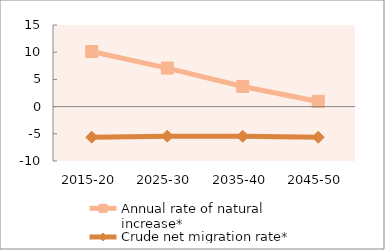
| Category | Annual rate of natural increase* | Crude net migration rate* |
|---|---|---|
| 2015-20 | 10.126 | -5.623 |
| 2025-30 | 7.084 | -5.446 |
| 2035-40 | 3.694 | -5.452 |
| 2045-50 | 0.949 | -5.631 |